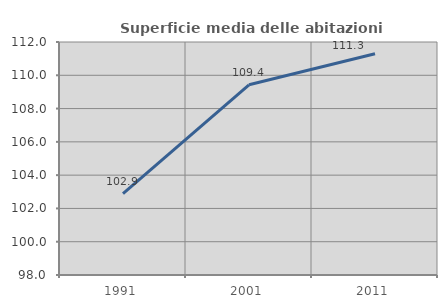
| Category | Superficie media delle abitazioni occupate |
|---|---|
| 1991.0 | 102.888 |
| 2001.0 | 109.43 |
| 2011.0 | 111.293 |